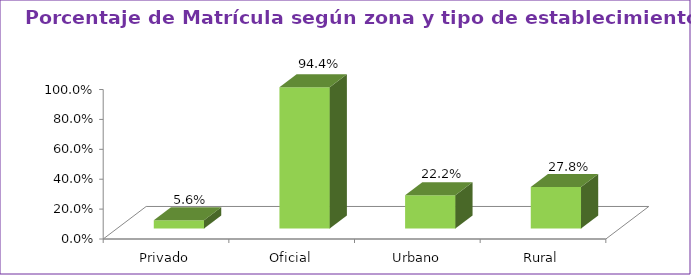
| Category | Series 1 |
|---|---|
| Privado | 0.056 |
| Oficial | 0.944 |
| Urbano | 0.222 |
| Rural | 0.278 |